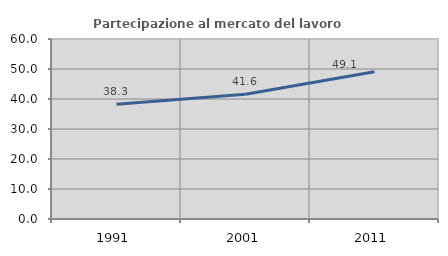
| Category | Partecipazione al mercato del lavoro  femminile |
|---|---|
| 1991.0 | 38.259 |
| 2001.0 | 41.566 |
| 2011.0 | 49.057 |